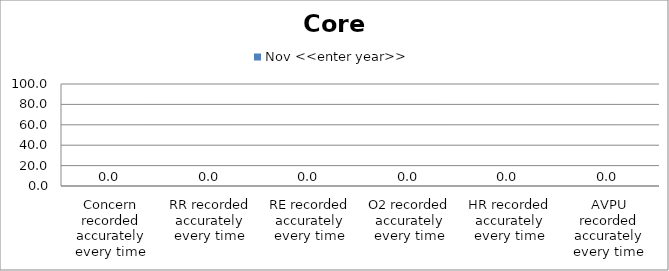
| Category | Nov <<enter year>> |
|---|---|
| Concern recorded accurately every time | 0 |
| RR recorded accurately every time | 0 |
| RE recorded accurately every time | 0 |
| O2 recorded accurately every time | 0 |
| HR recorded accurately every time | 0 |
| AVPU recorded accurately every time | 0 |